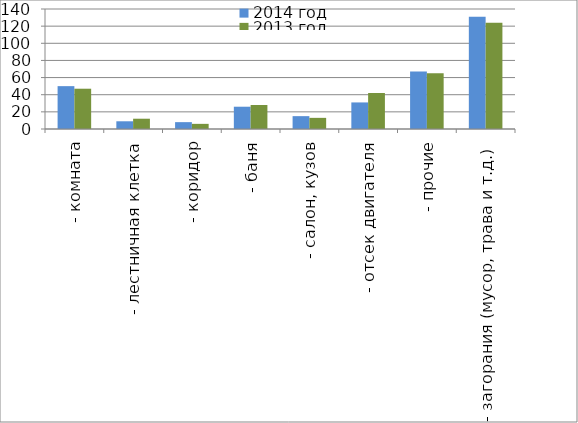
| Category | 2014 год | 2013 год |
|---|---|---|
|  - комната | 50 | 47 |
|  - лестничная клетка | 9 | 12 |
|  - коридор | 8 | 6 |
|  - баня | 26 | 28 |
|  - салон, кузов | 15 | 13 |
|  - отсек двигателя | 31 | 42 |
| - прочие | 67 | 65 |
| - загорания (мусор, трава и т.д.)  | 131 | 124 |